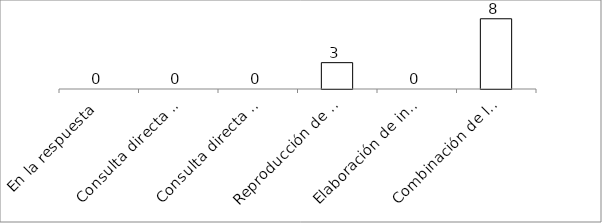
| Category | Series 0 |
|---|---|
| En la respuesta | 0 |
| Consulta directa personal | 0 |
| Consulta directa electrónica | 0 |
| Reproducción de documentos | 3 |
| Elaboración de informes | 0 |
| Combinación de las anteriores | 8 |